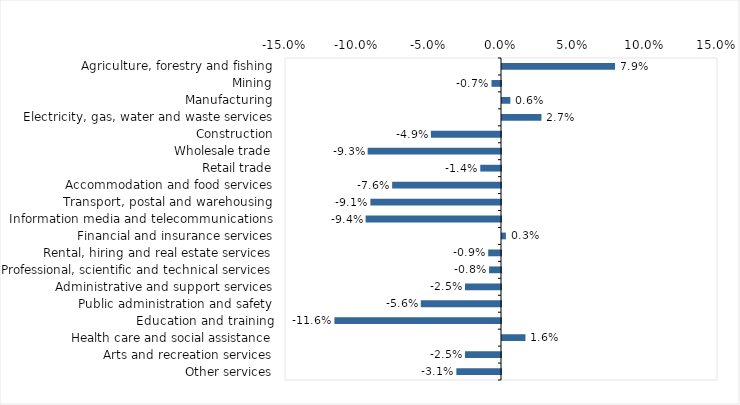
| Category | This week |
|---|---|
| Agriculture, forestry and fishing | 0.078 |
| Mining | -0.007 |
| Manufacturing | 0.006 |
| Electricity, gas, water and waste services | 0.027 |
| Construction | -0.049 |
| Wholesale trade | -0.093 |
| Retail trade | -0.014 |
| Accommodation and food services | -0.076 |
| Transport, postal and warehousing | -0.091 |
| Information media and telecommunications | -0.094 |
| Financial and insurance services | 0.003 |
| Rental, hiring and real estate services | -0.009 |
| Professional, scientific and technical services | -0.008 |
| Administrative and support services | -0.025 |
| Public administration and safety | -0.056 |
| Education and training | -0.116 |
| Health care and social assistance | 0.016 |
| Arts and recreation services | -0.025 |
| Other services | -0.031 |